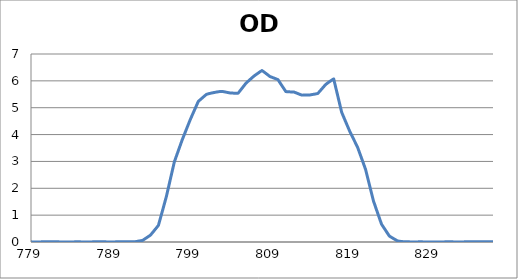
| Category | Series 0 |
|---|---|
| 2600.0 | 0.08 |
| 2599.0 | 0.078 |
| 2598.0 | 0.077 |
| 2597.0 | 0.075 |
| 2596.0 | 0.072 |
| 2595.0 | 0.069 |
| 2594.0 | 0.066 |
| 2593.0 | 0.063 |
| 2592.0 | 0.06 |
| 2591.0 | 0.057 |
| 2590.0 | 0.054 |
| 2589.0 | 0.051 |
| 2588.0 | 0.049 |
| 2587.0 | 0.046 |
| 2586.0 | 0.044 |
| 2585.0 | 0.043 |
| 2584.0 | 0.041 |
| 2583.0 | 0.04 |
| 2582.0 | 0.039 |
| 2581.0 | 0.039 |
| 2580.0 | 0.039 |
| 2579.0 | 0.039 |
| 2578.0 | 0.04 |
| 2577.0 | 0.041 |
| 2576.0 | 0.042 |
| 2575.0 | 0.044 |
| 2574.0 | 0.046 |
| 2573.0 | 0.049 |
| 2572.0 | 0.052 |
| 2571.0 | 0.055 |
| 2570.0 | 0.059 |
| 2569.0 | 0.063 |
| 2568.0 | 0.067 |
| 2567.0 | 0.072 |
| 2566.0 | 0.076 |
| 2565.0 | 0.08 |
| 2564.0 | 0.084 |
| 2563.0 | 0.087 |
| 2562.0 | 0.091 |
| 2561.0 | 0.093 |
| 2560.0 | 0.096 |
| 2559.0 | 0.098 |
| 2558.0 | 0.099 |
| 2557.0 | 0.101 |
| 2556.0 | 0.101 |
| 2555.0 | 0.102 |
| 2554.0 | 0.102 |
| 2553.0 | 0.102 |
| 2552.0 | 0.101 |
| 2551.0 | 0.1 |
| 2550.0 | 0.098 |
| 2549.0 | 0.095 |
| 2548.0 | 0.093 |
| 2547.0 | 0.09 |
| 2546.0 | 0.086 |
| 2545.0 | 0.083 |
| 2544.0 | 0.08 |
| 2543.0 | 0.076 |
| 2542.0 | 0.073 |
| 2541.0 | 0.069 |
| 2540.0 | 0.066 |
| 2539.0 | 0.063 |
| 2538.0 | 0.059 |
| 2537.0 | 0.056 |
| 2536.0 | 0.052 |
| 2535.0 | 0.049 |
| 2534.0 | 0.046 |
| 2533.0 | 0.044 |
| 2532.0 | 0.042 |
| 2531.0 | 0.039 |
| 2530.0 | 0.038 |
| 2529.0 | 0.037 |
| 2528.0 | 0.036 |
| 2527.0 | 0.035 |
| 2526.0 | 0.035 |
| 2525.0 | 0.035 |
| 2524.0 | 0.035 |
| 2523.0 | 0.035 |
| 2522.0 | 0.036 |
| 2521.0 | 0.037 |
| 2520.0 | 0.038 |
| 2519.0 | 0.039 |
| 2518.0 | 0.04 |
| 2517.0 | 0.041 |
| 2516.0 | 0.042 |
| 2515.0 | 0.043 |
| 2514.0 | 0.044 |
| 2513.0 | 0.045 |
| 2512.0 | 0.046 |
| 2511.0 | 0.046 |
| 2510.0 | 0.046 |
| 2509.0 | 0.047 |
| 2508.0 | 0.047 |
| 2507.0 | 0.047 |
| 2506.0 | 0.047 |
| 2505.0 | 0.046 |
| 2504.0 | 0.046 |
| 2503.0 | 0.045 |
| 2502.0 | 0.045 |
| 2501.0 | 0.044 |
| 2500.0 | 0.044 |
| 2499.0 | 0.043 |
| 2498.0 | 0.042 |
| 2497.0 | 0.041 |
| 2496.0 | 0.041 |
| 2495.0 | 0.04 |
| 2494.0 | 0.04 |
| 2493.0 | 0.039 |
| 2492.0 | 0.039 |
| 2491.0 | 0.039 |
| 2490.0 | 0.038 |
| 2489.0 | 0.038 |
| 2488.0 | 0.038 |
| 2487.0 | 0.038 |
| 2486.0 | 0.038 |
| 2485.0 | 0.038 |
| 2484.0 | 0.038 |
| 2483.0 | 0.037 |
| 2482.0 | 0.037 |
| 2481.0 | 0.037 |
| 2480.0 | 0.037 |
| 2479.0 | 0.037 |
| 2478.0 | 0.037 |
| 2477.0 | 0.037 |
| 2476.0 | 0.037 |
| 2475.0 | 0.037 |
| 2474.0 | 0.036 |
| 2473.0 | 0.036 |
| 2472.0 | 0.036 |
| 2471.0 | 0.036 |
| 2470.0 | 0.036 |
| 2469.0 | 0.036 |
| 2468.0 | 0.036 |
| 2467.0 | 0.037 |
| 2466.0 | 0.037 |
| 2465.0 | 0.038 |
| 2464.0 | 0.039 |
| 2463.0 | 0.04 |
| 2462.0 | 0.042 |
| 2461.0 | 0.044 |
| 2460.0 | 0.046 |
| 2459.0 | 0.048 |
| 2458.0 | 0.051 |
| 2457.0 | 0.053 |
| 2456.0 | 0.056 |
| 2455.0 | 0.06 |
| 2454.0 | 0.063 |
| 2453.0 | 0.067 |
| 2452.0 | 0.07 |
| 2451.0 | 0.074 |
| 2450.0 | 0.077 |
| 2449.0 | 0.081 |
| 2448.0 | 0.084 |
| 2447.0 | 0.087 |
| 2446.0 | 0.09 |
| 2445.0 | 0.093 |
| 2444.0 | 0.096 |
| 2443.0 | 0.098 |
| 2442.0 | 0.1 |
| 2441.0 | 0.101 |
| 2440.0 | 0.102 |
| 2439.0 | 0.103 |
| 2438.0 | 0.103 |
| 2437.0 | 0.103 |
| 2436.0 | 0.102 |
| 2435.0 | 0.101 |
| 2434.0 | 0.1 |
| 2433.0 | 0.098 |
| 2432.0 | 0.096 |
| 2431.0 | 0.094 |
| 2430.0 | 0.091 |
| 2429.0 | 0.089 |
| 2428.0 | 0.086 |
| 2427.0 | 0.083 |
| 2426.0 | 0.081 |
| 2425.0 | 0.078 |
| 2424.0 | 0.076 |
| 2423.0 | 0.074 |
| 2422.0 | 0.073 |
| 2421.0 | 0.072 |
| 2420.0 | 0.071 |
| 2419.0 | 0.071 |
| 2418.0 | 0.071 |
| 2417.0 | 0.071 |
| 2416.0 | 0.072 |
| 2415.0 | 0.073 |
| 2414.0 | 0.075 |
| 2413.0 | 0.077 |
| 2412.0 | 0.08 |
| 2411.0 | 0.083 |
| 2410.0 | 0.086 |
| 2409.0 | 0.088 |
| 2408.0 | 0.092 |
| 2407.0 | 0.095 |
| 2406.0 | 0.098 |
| 2405.0 | 0.101 |
| 2404.0 | 0.103 |
| 2403.0 | 0.106 |
| 2402.0 | 0.108 |
| 2401.0 | 0.11 |
| 2400.0 | 0.111 |
| 2399.0 | 0.112 |
| 2398.0 | 0.113 |
| 2397.0 | 0.113 |
| 2396.0 | 0.113 |
| 2395.0 | 0.112 |
| 2394.0 | 0.111 |
| 2393.0 | 0.109 |
| 2392.0 | 0.108 |
| 2391.0 | 0.105 |
| 2390.0 | 0.103 |
| 2389.0 | 0.1 |
| 2388.0 | 0.097 |
| 2387.0 | 0.094 |
| 2386.0 | 0.091 |
| 2385.0 | 0.089 |
| 2384.0 | 0.086 |
| 2383.0 | 0.083 |
| 2382.0 | 0.081 |
| 2381.0 | 0.079 |
| 2380.0 | 0.077 |
| 2379.0 | 0.076 |
| 2378.0 | 0.075 |
| 2377.0 | 0.074 |
| 2376.0 | 0.073 |
| 2375.0 | 0.073 |
| 2374.0 | 0.073 |
| 2373.0 | 0.073 |
| 2372.0 | 0.073 |
| 2371.0 | 0.073 |
| 2370.0 | 0.074 |
| 2369.0 | 0.074 |
| 2368.0 | 0.075 |
| 2367.0 | 0.075 |
| 2366.0 | 0.075 |
| 2365.0 | 0.075 |
| 2364.0 | 0.075 |
| 2363.0 | 0.075 |
| 2362.0 | 0.074 |
| 2361.0 | 0.074 |
| 2360.0 | 0.073 |
| 2359.0 | 0.071 |
| 2358.0 | 0.07 |
| 2357.0 | 0.068 |
| 2356.0 | 0.067 |
| 2355.0 | 0.065 |
| 2354.0 | 0.063 |
| 2353.0 | 0.061 |
| 2352.0 | 0.06 |
| 2351.0 | 0.058 |
| 2350.0 | 0.057 |
| 2349.0 | 0.056 |
| 2348.0 | 0.055 |
| 2347.0 | 0.055 |
| 2346.0 | 0.054 |
| 2345.0 | 0.055 |
| 2344.0 | 0.055 |
| 2343.0 | 0.056 |
| 2342.0 | 0.058 |
| 2341.0 | 0.059 |
| 2340.0 | 0.061 |
| 2339.0 | 0.063 |
| 2338.0 | 0.065 |
| 2337.0 | 0.067 |
| 2336.0 | 0.069 |
| 2335.0 | 0.071 |
| 2334.0 | 0.073 |
| 2333.0 | 0.075 |
| 2332.0 | 0.076 |
| 2331.0 | 0.077 |
| 2330.0 | 0.078 |
| 2329.0 | 0.078 |
| 2328.0 | 0.078 |
| 2327.0 | 0.078 |
| 2326.0 | 0.077 |
| 2325.0 | 0.076 |
| 2324.0 | 0.074 |
| 2323.0 | 0.073 |
| 2322.0 | 0.071 |
| 2321.0 | 0.069 |
| 2320.0 | 0.067 |
| 2319.0 | 0.065 |
| 2318.0 | 0.064 |
| 2317.0 | 0.062 |
| 2316.0 | 0.062 |
| 2315.0 | 0.061 |
| 2314.0 | 0.062 |
| 2313.0 | 0.063 |
| 2312.0 | 0.065 |
| 2311.0 | 0.068 |
| 2310.0 | 0.071 |
| 2309.0 | 0.075 |
| 2308.0 | 0.08 |
| 2307.0 | 0.086 |
| 2306.0 | 0.092 |
| 2305.0 | 0.098 |
| 2304.0 | 0.105 |
| 2303.0 | 0.113 |
| 2302.0 | 0.12 |
| 2301.0 | 0.127 |
| 2300.0 | 0.133 |
| 2299.0 | 0.14 |
| 2298.0 | 0.146 |
| 2297.0 | 0.151 |
| 2296.0 | 0.156 |
| 2295.0 | 0.16 |
| 2294.0 | 0.162 |
| 2293.0 | 0.165 |
| 2292.0 | 0.166 |
| 2291.0 | 0.166 |
| 2290.0 | 0.166 |
| 2289.0 | 0.164 |
| 2288.0 | 0.162 |
| 2287.0 | 0.159 |
| 2286.0 | 0.155 |
| 2285.0 | 0.15 |
| 2284.0 | 0.145 |
| 2283.0 | 0.139 |
| 2282.0 | 0.134 |
| 2281.0 | 0.128 |
| 2280.0 | 0.122 |
| 2279.0 | 0.116 |
| 2278.0 | 0.111 |
| 2277.0 | 0.106 |
| 2276.0 | 0.102 |
| 2275.0 | 0.099 |
| 2274.0 | 0.097 |
| 2273.0 | 0.096 |
| 2272.0 | 0.096 |
| 2271.0 | 0.097 |
| 2270.0 | 0.099 |
| 2269.0 | 0.102 |
| 2268.0 | 0.106 |
| 2267.0 | 0.111 |
| 2266.0 | 0.116 |
| 2265.0 | 0.121 |
| 2264.0 | 0.126 |
| 2263.0 | 0.132 |
| 2262.0 | 0.137 |
| 2261.0 | 0.142 |
| 2260.0 | 0.147 |
| 2259.0 | 0.151 |
| 2258.0 | 0.155 |
| 2257.0 | 0.157 |
| 2256.0 | 0.159 |
| 2255.0 | 0.16 |
| 2254.0 | 0.161 |
| 2253.0 | 0.16 |
| 2252.0 | 0.159 |
| 2251.0 | 0.157 |
| 2250.0 | 0.154 |
| 2249.0 | 0.151 |
| 2248.0 | 0.147 |
| 2247.0 | 0.142 |
| 2246.0 | 0.138 |
| 2245.0 | 0.134 |
| 2244.0 | 0.129 |
| 2243.0 | 0.125 |
| 2242.0 | 0.12 |
| 2241.0 | 0.116 |
| 2240.0 | 0.113 |
| 2239.0 | 0.11 |
| 2238.0 | 0.108 |
| 2237.0 | 0.106 |
| 2236.0 | 0.106 |
| 2235.0 | 0.105 |
| 2234.0 | 0.106 |
| 2233.0 | 0.107 |
| 2232.0 | 0.108 |
| 2231.0 | 0.11 |
| 2230.0 | 0.112 |
| 2229.0 | 0.114 |
| 2228.0 | 0.116 |
| 2227.0 | 0.117 |
| 2226.0 | 0.119 |
| 2225.0 | 0.12 |
| 2224.0 | 0.12 |
| 2223.0 | 0.121 |
| 2222.0 | 0.12 |
| 2221.0 | 0.119 |
| 2220.0 | 0.118 |
| 2219.0 | 0.115 |
| 2218.0 | 0.113 |
| 2217.0 | 0.111 |
| 2216.0 | 0.107 |
| 2215.0 | 0.105 |
| 2214.0 | 0.102 |
| 2213.0 | 0.098 |
| 2212.0 | 0.096 |
| 2211.0 | 0.093 |
| 2210.0 | 0.09 |
| 2209.0 | 0.089 |
| 2208.0 | 0.087 |
| 2207.0 | 0.087 |
| 2206.0 | 0.087 |
| 2205.0 | 0.087 |
| 2204.0 | 0.088 |
| 2203.0 | 0.09 |
| 2202.0 | 0.092 |
| 2201.0 | 0.094 |
| 2200.0 | 0.097 |
| 2199.0 | 0.1 |
| 2198.0 | 0.103 |
| 2197.0 | 0.105 |
| 2196.0 | 0.108 |
| 2195.0 | 0.11 |
| 2194.0 | 0.111 |
| 2193.0 | 0.112 |
| 2192.0 | 0.113 |
| 2191.0 | 0.113 |
| 2190.0 | 0.112 |
| 2189.0 | 0.111 |
| 2188.0 | 0.109 |
| 2187.0 | 0.107 |
| 2186.0 | 0.104 |
| 2185.0 | 0.102 |
| 2184.0 | 0.099 |
| 2183.0 | 0.097 |
| 2182.0 | 0.095 |
| 2181.0 | 0.095 |
| 2180.0 | 0.094 |
| 2179.0 | 0.095 |
| 2178.0 | 0.097 |
| 2177.0 | 0.099 |
| 2176.0 | 0.103 |
| 2175.0 | 0.108 |
| 2174.0 | 0.113 |
| 2173.0 | 0.12 |
| 2172.0 | 0.127 |
| 2171.0 | 0.135 |
| 2170.0 | 0.144 |
| 2169.0 | 0.152 |
| 2168.0 | 0.161 |
| 2167.0 | 0.169 |
| 2166.0 | 0.177 |
| 2165.0 | 0.185 |
| 2164.0 | 0.192 |
| 2163.0 | 0.198 |
| 2162.0 | 0.203 |
| 2161.0 | 0.207 |
| 2160.0 | 0.21 |
| 2159.0 | 0.212 |
| 2158.0 | 0.213 |
| 2157.0 | 0.212 |
| 2156.0 | 0.211 |
| 2155.0 | 0.209 |
| 2154.0 | 0.206 |
| 2153.0 | 0.202 |
| 2152.0 | 0.198 |
| 2151.0 | 0.193 |
| 2150.0 | 0.189 |
| 2149.0 | 0.185 |
| 2148.0 | 0.181 |
| 2147.0 | 0.178 |
| 2146.0 | 0.176 |
| 2145.0 | 0.175 |
| 2144.0 | 0.175 |
| 2143.0 | 0.177 |
| 2142.0 | 0.179 |
| 2141.0 | 0.183 |
| 2140.0 | 0.187 |
| 2139.0 | 0.193 |
| 2138.0 | 0.199 |
| 2137.0 | 0.206 |
| 2136.0 | 0.213 |
| 2135.0 | 0.22 |
| 2134.0 | 0.228 |
| 2133.0 | 0.234 |
| 2132.0 | 0.241 |
| 2131.0 | 0.247 |
| 2130.0 | 0.252 |
| 2129.0 | 0.257 |
| 2128.0 | 0.261 |
| 2127.0 | 0.264 |
| 2126.0 | 0.266 |
| 2125.0 | 0.268 |
| 2124.0 | 0.268 |
| 2123.0 | 0.269 |
| 2122.0 | 0.268 |
| 2121.0 | 0.267 |
| 2120.0 | 0.266 |
| 2119.0 | 0.265 |
| 2118.0 | 0.263 |
| 2117.0 | 0.262 |
| 2116.0 | 0.261 |
| 2115.0 | 0.26 |
| 2114.0 | 0.259 |
| 2113.0 | 0.259 |
| 2112.0 | 0.259 |
| 2111.0 | 0.26 |
| 2110.0 | 0.262 |
| 2109.0 | 0.263 |
| 2108.0 | 0.265 |
| 2107.0 | 0.267 |
| 2106.0 | 0.268 |
| 2105.0 | 0.27 |
| 2104.0 | 0.271 |
| 2103.0 | 0.272 |
| 2102.0 | 0.272 |
| 2101.0 | 0.271 |
| 2100.0 | 0.27 |
| 2099.0 | 0.267 |
| 2098.0 | 0.264 |
| 2097.0 | 0.261 |
| 2096.0 | 0.256 |
| 2095.0 | 0.252 |
| 2094.0 | 0.246 |
| 2093.0 | 0.241 |
| 2092.0 | 0.235 |
| 2091.0 | 0.228 |
| 2090.0 | 0.223 |
| 2089.0 | 0.217 |
| 2088.0 | 0.212 |
| 2087.0 | 0.208 |
| 2086.0 | 0.205 |
| 2085.0 | 0.202 |
| 2084.0 | 0.201 |
| 2083.0 | 0.201 |
| 2082.0 | 0.202 |
| 2081.0 | 0.203 |
| 2080.0 | 0.206 |
| 2079.0 | 0.209 |
| 2078.0 | 0.213 |
| 2077.0 | 0.217 |
| 2076.0 | 0.221 |
| 2075.0 | 0.224 |
| 2074.0 | 0.227 |
| 2073.0 | 0.23 |
| 2072.0 | 0.232 |
| 2071.0 | 0.232 |
| 2070.0 | 0.232 |
| 2069.0 | 0.23 |
| 2068.0 | 0.227 |
| 2067.0 | 0.223 |
| 2066.0 | 0.218 |
| 2065.0 | 0.212 |
| 2064.0 | 0.205 |
| 2063.0 | 0.198 |
| 2062.0 | 0.191 |
| 2061.0 | 0.184 |
| 2060.0 | 0.176 |
| 2059.0 | 0.17 |
| 2058.0 | 0.164 |
| 2057.0 | 0.159 |
| 2056.0 | 0.155 |
| 2055.0 | 0.153 |
| 2054.0 | 0.152 |
| 2053.0 | 0.152 |
| 2052.0 | 0.153 |
| 2051.0 | 0.156 |
| 2050.0 | 0.159 |
| 2049.0 | 0.163 |
| 2048.0 | 0.167 |
| 2047.0 | 0.171 |
| 2046.0 | 0.176 |
| 2045.0 | 0.18 |
| 2044.0 | 0.183 |
| 2043.0 | 0.186 |
| 2042.0 | 0.188 |
| 2041.0 | 0.189 |
| 2040.0 | 0.188 |
| 2039.0 | 0.187 |
| 2038.0 | 0.185 |
| 2037.0 | 0.181 |
| 2036.0 | 0.177 |
| 2035.0 | 0.172 |
| 2034.0 | 0.167 |
| 2033.0 | 0.162 |
| 2032.0 | 0.157 |
| 2031.0 | 0.152 |
| 2030.0 | 0.148 |
| 2029.0 | 0.145 |
| 2028.0 | 0.143 |
| 2027.0 | 0.143 |
| 2026.0 | 0.143 |
| 2025.0 | 0.145 |
| 2024.0 | 0.148 |
| 2023.0 | 0.152 |
| 2022.0 | 0.157 |
| 2021.0 | 0.162 |
| 2020.0 | 0.167 |
| 2019.0 | 0.172 |
| 2018.0 | 0.178 |
| 2017.0 | 0.183 |
| 2016.0 | 0.186 |
| 2015.0 | 0.19 |
| 2014.0 | 0.192 |
| 2013.0 | 0.194 |
| 2012.0 | 0.194 |
| 2011.0 | 0.194 |
| 2010.0 | 0.193 |
| 2009.0 | 0.192 |
| 2008.0 | 0.19 |
| 2007.0 | 0.187 |
| 2006.0 | 0.185 |
| 2005.0 | 0.182 |
| 2004.0 | 0.18 |
| 2003.0 | 0.178 |
| 2002.0 | 0.177 |
| 2001.0 | 0.176 |
| 2000.0 | 0.177 |
| 1999.0 | 0.179 |
| 1998.0 | 0.181 |
| 1997.0 | 0.185 |
| 1996.0 | 0.189 |
| 1995.0 | 0.193 |
| 1994.0 | 0.198 |
| 1993.0 | 0.204 |
| 1992.0 | 0.209 |
| 1991.0 | 0.213 |
| 1990.0 | 0.217 |
| 1989.0 | 0.22 |
| 1988.0 | 0.222 |
| 1987.0 | 0.224 |
| 1986.0 | 0.224 |
| 1985.0 | 0.223 |
| 1984.0 | 0.221 |
| 1983.0 | 0.218 |
| 1982.0 | 0.215 |
| 1981.0 | 0.211 |
| 1980.0 | 0.206 |
| 1979.0 | 0.201 |
| 1978.0 | 0.196 |
| 1977.0 | 0.191 |
| 1976.0 | 0.187 |
| 1975.0 | 0.183 |
| 1974.0 | 0.18 |
| 1973.0 | 0.177 |
| 1972.0 | 0.175 |
| 1971.0 | 0.174 |
| 1970.0 | 0.174 |
| 1969.0 | 0.174 |
| 1968.0 | 0.174 |
| 1967.0 | 0.175 |
| 1966.0 | 0.176 |
| 1965.0 | 0.177 |
| 1964.0 | 0.178 |
| 1963.0 | 0.178 |
| 1962.0 | 0.178 |
| 1961.0 | 0.178 |
| 1960.0 | 0.177 |
| 1959.0 | 0.175 |
| 1958.0 | 0.173 |
| 1957.0 | 0.17 |
| 1956.0 | 0.167 |
| 1955.0 | 0.164 |
| 1954.0 | 0.161 |
| 1953.0 | 0.158 |
| 1952.0 | 0.155 |
| 1951.0 | 0.152 |
| 1950.0 | 0.15 |
| 1949.0 | 0.149 |
| 1948.0 | 0.148 |
| 1947.0 | 0.148 |
| 1946.0 | 0.148 |
| 1945.0 | 0.149 |
| 1944.0 | 0.151 |
| 1943.0 | 0.152 |
| 1942.0 | 0.154 |
| 1941.0 | 0.155 |
| 1940.0 | 0.157 |
| 1939.0 | 0.158 |
| 1938.0 | 0.159 |
| 1937.0 | 0.16 |
| 1936.0 | 0.16 |
| 1935.0 | 0.159 |
| 1934.0 | 0.158 |
| 1933.0 | 0.158 |
| 1932.0 | 0.157 |
| 1931.0 | 0.155 |
| 1930.0 | 0.155 |
| 1929.0 | 0.154 |
| 1928.0 | 0.154 |
| 1927.0 | 0.154 |
| 1926.0 | 0.155 |
| 1925.0 | 0.157 |
| 1924.0 | 0.159 |
| 1923.0 | 0.161 |
| 1922.0 | 0.165 |
| 1921.0 | 0.169 |
| 1920.0 | 0.173 |
| 1919.0 | 0.178 |
| 1918.0 | 0.182 |
| 1917.0 | 0.184 |
| 1916.0 | 0.187 |
| 1915.0 | 0.189 |
| 1914.0 | 0.191 |
| 1913.0 | 0.193 |
| 1912.0 | 0.194 |
| 1911.0 | 0.194 |
| 1910.0 | 0.193 |
| 1909.0 | 0.191 |
| 1908.0 | 0.19 |
| 1907.0 | 0.188 |
| 1906.0 | 0.187 |
| 1905.0 | 0.186 |
| 1904.0 | 0.185 |
| 1903.0 | 0.185 |
| 1902.0 | 0.184 |
| 1901.0 | 0.185 |
| 1900.0 | 0.187 |
| 1899.0 | 0.19 |
| 1898.0 | 0.193 |
| 1897.0 | 0.196 |
| 1896.0 | 0.199 |
| 1895.0 | 0.202 |
| 1894.0 | 0.205 |
| 1893.0 | 0.208 |
| 1892.0 | 0.212 |
| 1891.0 | 0.215 |
| 1890.0 | 0.217 |
| 1889.0 | 0.218 |
| 1888.0 | 0.217 |
| 1887.0 | 0.216 |
| 1886.0 | 0.214 |
| 1885.0 | 0.211 |
| 1884.0 | 0.208 |
| 1883.0 | 0.204 |
| 1882.0 | 0.2 |
| 1881.0 | 0.195 |
| 1880.0 | 0.19 |
| 1879.0 | 0.185 |
| 1878.0 | 0.181 |
| 1877.0 | 0.177 |
| 1876.0 | 0.174 |
| 1875.0 | 0.171 |
| 1874.0 | 0.169 |
| 1873.0 | 0.168 |
| 1872.0 | 0.167 |
| 1871.0 | 0.166 |
| 1870.0 | 0.166 |
| 1869.0 | 0.166 |
| 1868.0 | 0.166 |
| 1867.0 | 0.167 |
| 1866.0 | 0.166 |
| 1865.0 | 0.166 |
| 1864.0 | 0.166 |
| 1863.0 | 0.166 |
| 1862.0 | 0.165 |
| 1861.0 | 0.166 |
| 1860.0 | 0.166 |
| 1859.0 | 0.167 |
| 1858.0 | 0.167 |
| 1857.0 | 0.167 |
| 1856.0 | 0.168 |
| 1855.0 | 0.168 |
| 1854.0 | 0.169 |
| 1853.0 | 0.171 |
| 1852.0 | 0.172 |
| 1851.0 | 0.173 |
| 1850.0 | 0.173 |
| 1849.0 | 0.174 |
| 1848.0 | 0.174 |
| 1847.0 | 0.176 |
| 1846.0 | 0.176 |
| 1845.0 | 0.176 |
| 1844.0 | 0.175 |
| 1843.0 | 0.173 |
| 1842.0 | 0.172 |
| 1841.0 | 0.172 |
| 1840.0 | 0.173 |
| 1839.0 | 0.173 |
| 1838.0 | 0.173 |
| 1837.0 | 0.175 |
| 1836.0 | 0.177 |
| 1835.0 | 0.179 |
| 1834.0 | 0.182 |
| 1833.0 | 0.185 |
| 1832.0 | 0.188 |
| 1831.0 | 0.193 |
| 1830.0 | 0.198 |
| 1829.0 | 0.202 |
| 1828.0 | 0.205 |
| 1827.0 | 0.209 |
| 1826.0 | 0.211 |
| 1825.0 | 0.213 |
| 1824.0 | 0.214 |
| 1823.0 | 0.213 |
| 1822.0 | 0.213 |
| 1821.0 | 0.213 |
| 1820.0 | 0.213 |
| 1819.0 | 0.212 |
| 1818.0 | 0.212 |
| 1817.0 | 0.211 |
| 1816.0 | 0.211 |
| 1815.0 | 0.212 |
| 1814.0 | 0.214 |
| 1813.0 | 0.216 |
| 1812.0 | 0.22 |
| 1811.0 | 0.225 |
| 1810.0 | 0.23 |
| 1809.0 | 0.234 |
| 1808.0 | 0.239 |
| 1807.0 | 0.244 |
| 1806.0 | 0.249 |
| 1805.0 | 0.253 |
| 1804.0 | 0.256 |
| 1803.0 | 0.259 |
| 1802.0 | 0.26 |
| 1801.0 | 0.26 |
| 1800.0 | 0.259 |
| 1799.0 | 0.257 |
| 1798.0 | 0.255 |
| 1797.0 | 0.252 |
| 1796.0 | 0.249 |
| 1795.0 | 0.246 |
| 1794.0 | 0.244 |
| 1793.0 | 0.242 |
| 1792.0 | 0.241 |
| 1791.0 | 0.241 |
| 1790.0 | 0.241 |
| 1789.0 | 0.242 |
| 1788.0 | 0.244 |
| 1787.0 | 0.245 |
| 1786.0 | 0.247 |
| 1785.0 | 0.248 |
| 1784.0 | 0.249 |
| 1783.0 | 0.249 |
| 1782.0 | 0.248 |
| 1781.0 | 0.246 |
| 1780.0 | 0.243 |
| 1779.0 | 0.239 |
| 1778.0 | 0.235 |
| 1777.0 | 0.23 |
| 1776.0 | 0.225 |
| 1775.0 | 0.22 |
| 1774.0 | 0.216 |
| 1773.0 | 0.212 |
| 1772.0 | 0.209 |
| 1771.0 | 0.208 |
| 1770.0 | 0.207 |
| 1769.0 | 0.207 |
| 1768.0 | 0.208 |
| 1767.0 | 0.209 |
| 1766.0 | 0.211 |
| 1765.0 | 0.212 |
| 1764.0 | 0.213 |
| 1763.0 | 0.213 |
| 1762.0 | 0.212 |
| 1761.0 | 0.21 |
| 1760.0 | 0.207 |
| 1759.0 | 0.203 |
| 1758.0 | 0.199 |
| 1757.0 | 0.195 |
| 1756.0 | 0.191 |
| 1755.0 | 0.188 |
| 1754.0 | 0.187 |
| 1753.0 | 0.187 |
| 1752.0 | 0.189 |
| 1751.0 | 0.193 |
| 1750.0 | 0.199 |
| 1749.0 | 0.207 |
| 1748.0 | 0.215 |
| 1747.0 | 0.224 |
| 1746.0 | 0.233 |
| 1745.0 | 0.241 |
| 1744.0 | 0.247 |
| 1743.0 | 0.252 |
| 1742.0 | 0.255 |
| 1741.0 | 0.255 |
| 1740.0 | 0.253 |
| 1739.0 | 0.249 |
| 1738.0 | 0.244 |
| 1737.0 | 0.237 |
| 1736.0 | 0.23 |
| 1735.0 | 0.224 |
| 1734.0 | 0.218 |
| 1733.0 | 0.215 |
| 1732.0 | 0.213 |
| 1731.0 | 0.215 |
| 1730.0 | 0.219 |
| 1729.0 | 0.226 |
| 1728.0 | 0.236 |
| 1727.0 | 0.248 |
| 1726.0 | 0.261 |
| 1725.0 | 0.274 |
| 1724.0 | 0.286 |
| 1723.0 | 0.297 |
| 1722.0 | 0.307 |
| 1721.0 | 0.315 |
| 1720.0 | 0.319 |
| 1719.0 | 0.321 |
| 1718.0 | 0.32 |
| 1717.0 | 0.317 |
| 1716.0 | 0.312 |
| 1715.0 | 0.305 |
| 1714.0 | 0.297 |
| 1713.0 | 0.29 |
| 1712.0 | 0.283 |
| 1711.0 | 0.278 |
| 1710.0 | 0.275 |
| 1709.0 | 0.274 |
| 1708.0 | 0.274 |
| 1707.0 | 0.277 |
| 1706.0 | 0.281 |
| 1705.0 | 0.285 |
| 1704.0 | 0.29 |
| 1703.0 | 0.293 |
| 1702.0 | 0.295 |
| 1701.0 | 0.296 |
| 1700.0 | 0.294 |
| 1699.0 | 0.291 |
| 1698.0 | 0.284 |
| 1697.0 | 0.277 |
| 1696.0 | 0.268 |
| 1695.0 | 0.258 |
| 1694.0 | 0.248 |
| 1693.0 | 0.237 |
| 1692.0 | 0.228 |
| 1691.0 | 0.219 |
| 1690.0 | 0.213 |
| 1689.0 | 0.208 |
| 1688.0 | 0.205 |
| 1687.0 | 0.204 |
| 1686.0 | 0.204 |
| 1685.0 | 0.205 |
| 1684.0 | 0.206 |
| 1683.0 | 0.207 |
| 1682.0 | 0.208 |
| 1681.0 | 0.208 |
| 1680.0 | 0.208 |
| 1679.0 | 0.206 |
| 1678.0 | 0.204 |
| 1677.0 | 0.202 |
| 1676.0 | 0.201 |
| 1675.0 | 0.2 |
| 1674.0 | 0.201 |
| 1673.0 | 0.204 |
| 1672.0 | 0.209 |
| 1671.0 | 0.216 |
| 1670.0 | 0.225 |
| 1669.0 | 0.235 |
| 1668.0 | 0.246 |
| 1667.0 | 0.257 |
| 1666.0 | 0.269 |
| 1665.0 | 0.28 |
| 1664.0 | 0.291 |
| 1663.0 | 0.301 |
| 1662.0 | 0.31 |
| 1661.0 | 0.318 |
| 1660.0 | 0.325 |
| 1659.0 | 0.333 |
| 1658.0 | 0.34 |
| 1657.0 | 0.347 |
| 1656.0 | 0.353 |
| 1655.0 | 0.359 |
| 1654.0 | 0.364 |
| 1653.0 | 0.369 |
| 1652.0 | 0.373 |
| 1651.0 | 0.375 |
| 1650.0 | 0.376 |
| 1649.0 | 0.376 |
| 1648.0 | 0.374 |
| 1647.0 | 0.37 |
| 1646.0 | 0.365 |
| 1645.0 | 0.36 |
| 1644.0 | 0.354 |
| 1643.0 | 0.35 |
| 1642.0 | 0.347 |
| 1641.0 | 0.347 |
| 1640.0 | 0.35 |
| 1639.0 | 0.356 |
| 1638.0 | 0.366 |
| 1637.0 | 0.378 |
| 1636.0 | 0.392 |
| 1635.0 | 0.407 |
| 1634.0 | 0.421 |
| 1633.0 | 0.434 |
| 1632.0 | 0.444 |
| 1631.0 | 0.45 |
| 1630.0 | 0.452 |
| 1629.0 | 0.449 |
| 1628.0 | 0.442 |
| 1627.0 | 0.43 |
| 1626.0 | 0.414 |
| 1625.0 | 0.395 |
| 1624.0 | 0.375 |
| 1623.0 | 0.355 |
| 1622.0 | 0.337 |
| 1621.0 | 0.323 |
| 1620.0 | 0.314 |
| 1619.0 | 0.31 |
| 1618.0 | 0.311 |
| 1617.0 | 0.317 |
| 1616.0 | 0.327 |
| 1615.0 | 0.338 |
| 1614.0 | 0.349 |
| 1613.0 | 0.359 |
| 1612.0 | 0.366 |
| 1611.0 | 0.369 |
| 1610.0 | 0.367 |
| 1609.0 | 0.36 |
| 1608.0 | 0.348 |
| 1607.0 | 0.332 |
| 1606.0 | 0.313 |
| 1605.0 | 0.292 |
| 1604.0 | 0.271 |
| 1603.0 | 0.251 |
| 1602.0 | 0.235 |
| 1601.0 | 0.224 |
| 1600.0 | 0.218 |
| 1599.0 | 0.218 |
| 1598.0 | 0.222 |
| 1597.0 | 0.228 |
| 1596.0 | 0.236 |
| 1595.0 | 0.242 |
| 1594.0 | 0.247 |
| 1593.0 | 0.247 |
| 1592.0 | 0.245 |
| 1591.0 | 0.238 |
| 1590.0 | 0.23 |
| 1589.0 | 0.22 |
| 1588.0 | 0.21 |
| 1587.0 | 0.203 |
| 1586.0 | 0.199 |
| 1585.0 | 0.2 |
| 1584.0 | 0.206 |
| 1583.0 | 0.216 |
| 1582.0 | 0.228 |
| 1581.0 | 0.242 |
| 1580.0 | 0.256 |
| 1579.0 | 0.267 |
| 1578.0 | 0.276 |
| 1577.0 | 0.281 |
| 1576.0 | 0.281 |
| 1575.0 | 0.277 |
| 1574.0 | 0.271 |
| 1573.0 | 0.262 |
| 1572.0 | 0.253 |
| 1571.0 | 0.246 |
| 1570.0 | 0.242 |
| 1569.0 | 0.242 |
| 1568.0 | 0.247 |
| 1567.0 | 0.258 |
| 1566.0 | 0.273 |
| 1565.0 | 0.291 |
| 1564.0 | 0.309 |
| 1563.0 | 0.327 |
| 1562.0 | 0.342 |
| 1561.0 | 0.352 |
| 1560.0 | 0.358 |
| 1559.0 | 0.358 |
| 1558.0 | 0.353 |
| 1557.0 | 0.343 |
| 1556.0 | 0.331 |
| 1555.0 | 0.318 |
| 1554.0 | 0.305 |
| 1553.0 | 0.296 |
| 1552.0 | 0.29 |
| 1551.0 | 0.29 |
| 1550.0 | 0.294 |
| 1549.0 | 0.301 |
| 1548.0 | 0.31 |
| 1547.0 | 0.319 |
| 1546.0 | 0.325 |
| 1545.0 | 0.328 |
| 1544.0 | 0.327 |
| 1543.0 | 0.32 |
| 1542.0 | 0.308 |
| 1541.0 | 0.293 |
| 1540.0 | 0.275 |
| 1539.0 | 0.256 |
| 1538.0 | 0.238 |
| 1537.0 | 0.225 |
| 1536.0 | 0.215 |
| 1535.0 | 0.212 |
| 1534.0 | 0.214 |
| 1533.0 | 0.222 |
| 1532.0 | 0.232 |
| 1531.0 | 0.243 |
| 1530.0 | 0.252 |
| 1529.0 | 0.26 |
| 1528.0 | 0.264 |
| 1527.0 | 0.264 |
| 1526.0 | 0.259 |
| 1525.0 | 0.253 |
| 1524.0 | 0.244 |
| 1523.0 | 0.237 |
| 1522.0 | 0.232 |
| 1521.0 | 0.231 |
| 1520.0 | 0.236 |
| 1519.0 | 0.245 |
| 1518.0 | 0.259 |
| 1517.0 | 0.274 |
| 1516.0 | 0.29 |
| 1515.0 | 0.304 |
| 1514.0 | 0.314 |
| 1513.0 | 0.321 |
| 1512.0 | 0.322 |
| 1511.0 | 0.319 |
| 1510.0 | 0.313 |
| 1509.0 | 0.306 |
| 1508.0 | 0.3 |
| 1507.0 | 0.297 |
| 1506.0 | 0.299 |
| 1505.0 | 0.305 |
| 1504.0 | 0.316 |
| 1503.0 | 0.33 |
| 1502.0 | 0.347 |
| 1501.0 | 0.363 |
| 1500.0 | 0.377 |
| 1499.0 | 0.387 |
| 1498.0 | 0.393 |
| 1497.0 | 0.394 |
| 1496.0 | 0.39 |
| 1495.0 | 0.383 |
| 1494.0 | 0.373 |
| 1493.0 | 0.362 |
| 1492.0 | 0.352 |
| 1491.0 | 0.344 |
| 1490.0 | 0.34 |
| 1489.0 | 0.339 |
| 1488.0 | 0.342 |
| 1487.0 | 0.348 |
| 1486.0 | 0.355 |
| 1485.0 | 0.361 |
| 1484.0 | 0.365 |
| 1483.0 | 0.365 |
| 1482.0 | 0.361 |
| 1481.0 | 0.353 |
| 1480.0 | 0.34 |
| 1479.0 | 0.325 |
| 1478.0 | 0.31 |
| 1477.0 | 0.295 |
| 1476.0 | 0.282 |
| 1475.0 | 0.273 |
| 1474.0 | 0.267 |
| 1473.0 | 0.265 |
| 1472.0 | 0.264 |
| 1471.0 | 0.263 |
| 1470.0 | 0.261 |
| 1469.0 | 0.256 |
| 1468.0 | 0.249 |
| 1467.0 | 0.238 |
| 1466.0 | 0.227 |
| 1465.0 | 0.216 |
| 1464.0 | 0.207 |
| 1463.0 | 0.203 |
| 1462.0 | 0.202 |
| 1461.0 | 0.205 |
| 1460.0 | 0.212 |
| 1459.0 | 0.22 |
| 1458.0 | 0.228 |
| 1457.0 | 0.233 |
| 1456.0 | 0.234 |
| 1455.0 | 0.23 |
| 1454.0 | 0.223 |
| 1453.0 | 0.213 |
| 1452.0 | 0.203 |
| 1451.0 | 0.195 |
| 1450.0 | 0.193 |
| 1449.0 | 0.197 |
| 1448.0 | 0.21 |
| 1447.0 | 0.23 |
| 1446.0 | 0.254 |
| 1445.0 | 0.279 |
| 1444.0 | 0.304 |
| 1443.0 | 0.322 |
| 1442.0 | 0.333 |
| 1441.0 | 0.337 |
| 1440.0 | 0.335 |
| 1439.0 | 0.326 |
| 1438.0 | 0.317 |
| 1437.0 | 0.31 |
| 1436.0 | 0.31 |
| 1435.0 | 0.318 |
| 1434.0 | 0.337 |
| 1433.0 | 0.364 |
| 1432.0 | 0.396 |
| 1431.0 | 0.428 |
| 1430.0 | 0.457 |
| 1429.0 | 0.477 |
| 1428.0 | 0.489 |
| 1427.0 | 0.489 |
| 1426.0 | 0.478 |
| 1425.0 | 0.457 |
| 1424.0 | 0.426 |
| 1423.0 | 0.391 |
| 1422.0 | 0.358 |
| 1421.0 | 0.33 |
| 1420.0 | 0.311 |
| 1419.0 | 0.306 |
| 1418.0 | 0.315 |
| 1417.0 | 0.332 |
| 1416.0 | 0.353 |
| 1415.0 | 0.375 |
| 1414.0 | 0.394 |
| 1413.0 | 0.405 |
| 1412.0 | 0.406 |
| 1411.0 | 0.396 |
| 1410.0 | 0.375 |
| 1409.0 | 0.347 |
| 1408.0 | 0.315 |
| 1407.0 | 0.281 |
| 1406.0 | 0.252 |
| 1405.0 | 0.228 |
| 1404.0 | 0.211 |
| 1403.0 | 0.205 |
| 1402.0 | 0.207 |
| 1401.0 | 0.216 |
| 1400.0 | 0.227 |
| 1399.0 | 0.236 |
| 1398.0 | 0.241 |
| 1397.0 | 0.239 |
| 1396.0 | 0.233 |
| 1395.0 | 0.224 |
| 1394.0 | 0.214 |
| 1393.0 | 0.202 |
| 1392.0 | 0.187 |
| 1391.0 | 0.175 |
| 1390.0 | 0.165 |
| 1389.0 | 0.156 |
| 1388.0 | 0.15 |
| 1387.0 | 0.15 |
| 1386.0 | 0.154 |
| 1385.0 | 0.164 |
| 1384.0 | 0.18 |
| 1383.0 | 0.203 |
| 1382.0 | 0.23 |
| 1381.0 | 0.256 |
| 1380.0 | 0.277 |
| 1379.0 | 0.291 |
| 1378.0 | 0.298 |
| 1377.0 | 0.295 |
| 1376.0 | 0.285 |
| 1375.0 | 0.267 |
| 1374.0 | 0.245 |
| 1373.0 | 0.223 |
| 1372.0 | 0.207 |
| 1371.0 | 0.203 |
| 1370.0 | 0.215 |
| 1369.0 | 0.24 |
| 1368.0 | 0.277 |
| 1367.0 | 0.32 |
| 1366.0 | 0.356 |
| 1365.0 | 0.385 |
| 1364.0 | 0.403 |
| 1363.0 | 0.405 |
| 1362.0 | 0.389 |
| 1361.0 | 0.358 |
| 1360.0 | 0.319 |
| 1359.0 | 0.274 |
| 1358.0 | 0.234 |
| 1357.0 | 0.206 |
| 1356.0 | 0.199 |
| 1355.0 | 0.214 |
| 1354.0 | 0.245 |
| 1353.0 | 0.281 |
| 1352.0 | 0.313 |
| 1351.0 | 0.334 |
| 1350.0 | 0.339 |
| 1349.0 | 0.327 |
| 1348.0 | 0.3 |
| 1347.0 | 0.26 |
| 1346.0 | 0.215 |
| 1345.0 | 0.171 |
| 1344.0 | 0.139 |
| 1343.0 | 0.125 |
| 1342.0 | 0.127 |
| 1341.0 | 0.141 |
| 1340.0 | 0.16 |
| 1339.0 | 0.176 |
| 1338.0 | 0.183 |
| 1337.0 | 0.178 |
| 1336.0 | 0.163 |
| 1335.0 | 0.143 |
| 1334.0 | 0.123 |
| 1333.0 | 0.113 |
| 1332.0 | 0.119 |
| 1331.0 | 0.142 |
| 1330.0 | 0.18 |
| 1329.0 | 0.223 |
| 1328.0 | 0.265 |
| 1327.0 | 0.297 |
| 1326.0 | 0.315 |
| 1325.0 | 0.316 |
| 1324.0 | 0.3 |
| 1323.0 | 0.27 |
| 1322.0 | 0.233 |
| 1321.0 | 0.196 |
| 1320.0 | 0.173 |
| 1319.0 | 0.17 |
| 1318.0 | 0.188 |
| 1317.0 | 0.224 |
| 1316.0 | 0.267 |
| 1315.0 | 0.307 |
| 1314.0 | 0.337 |
| 1313.0 | 0.351 |
| 1312.0 | 0.348 |
| 1311.0 | 0.33 |
| 1310.0 | 0.299 |
| 1309.0 | 0.26 |
| 1308.0 | 0.219 |
| 1307.0 | 0.186 |
| 1306.0 | 0.162 |
| 1305.0 | 0.151 |
| 1304.0 | 0.151 |
| 1303.0 | 0.156 |
| 1302.0 | 0.162 |
| 1301.0 | 0.163 |
| 1300.0 | 0.159 |
| 1299.0 | 0.149 |
| 1298.0 | 0.134 |
| 1297.0 | 0.118 |
| 1296.0 | 0.104 |
| 1295.0 | 0.092 |
| 1294.0 | 0.085 |
| 1293.0 | 0.082 |
| 1292.0 | 0.082 |
| 1291.0 | 0.083 |
| 1290.0 | 0.084 |
| 1289.0 | 0.086 |
| 1288.0 | 0.091 |
| 1287.0 | 0.1 |
| 1286.0 | 0.114 |
| 1285.0 | 0.133 |
| 1284.0 | 0.155 |
| 1283.0 | 0.176 |
| 1282.0 | 0.192 |
| 1281.0 | 0.201 |
| 1280.0 | 0.198 |
| 1279.0 | 0.186 |
| 1278.0 | 0.165 |
| 1277.0 | 0.14 |
| 1276.0 | 0.118 |
| 1275.0 | 0.105 |
| 1274.0 | 0.104 |
| 1273.0 | 0.116 |
| 1272.0 | 0.138 |
| 1271.0 | 0.163 |
| 1270.0 | 0.185 |
| 1269.0 | 0.2 |
| 1268.0 | 0.202 |
| 1267.0 | 0.194 |
| 1266.0 | 0.175 |
| 1265.0 | 0.151 |
| 1264.0 | 0.126 |
| 1263.0 | 0.104 |
| 1262.0 | 0.089 |
| 1261.0 | 0.083 |
| 1260.0 | 0.085 |
| 1259.0 | 0.091 |
| 1258.0 | 0.098 |
| 1257.0 | 0.103 |
| 1256.0 | 0.104 |
| 1255.0 | 0.102 |
| 1254.0 | 0.096 |
| 1253.0 | 0.089 |
| 1252.0 | 0.083 |
| 1251.0 | 0.078 |
| 1250.0 | 0.075 |
| 1249.0 | 0.073 |
| 1248.0 | 0.071 |
| 1247.0 | 0.07 |
| 1246.0 | 0.067 |
| 1245.0 | 0.064 |
| 1244.0 | 0.062 |
| 1243.0 | 0.061 |
| 1242.0 | 0.062 |
| 1241.0 | 0.067 |
| 1240.0 | 0.073 |
| 1239.0 | 0.079 |
| 1238.0 | 0.084 |
| 1237.0 | 0.086 |
| 1236.0 | 0.083 |
| 1235.0 | 0.077 |
| 1234.0 | 0.068 |
| 1233.0 | 0.06 |
| 1232.0 | 0.054 |
| 1231.0 | 0.052 |
| 1230.0 | 0.055 |
| 1229.0 | 0.061 |
| 1228.0 | 0.07 |
| 1227.0 | 0.078 |
| 1226.0 | 0.083 |
| 1225.0 | 0.083 |
| 1224.0 | 0.08 |
| 1223.0 | 0.073 |
| 1222.0 | 0.065 |
| 1221.0 | 0.058 |
| 1220.0 | 0.054 |
| 1219.0 | 0.054 |
| 1218.0 | 0.058 |
| 1217.0 | 0.064 |
| 1216.0 | 0.07 |
| 1215.0 | 0.074 |
| 1214.0 | 0.075 |
| 1213.0 | 0.072 |
| 1212.0 | 0.067 |
| 1211.0 | 0.061 |
| 1210.0 | 0.055 |
| 1209.0 | 0.053 |
| 1208.0 | 0.054 |
| 1207.0 | 0.058 |
| 1206.0 | 0.064 |
| 1205.0 | 0.068 |
| 1204.0 | 0.07 |
| 1203.0 | 0.069 |
| 1202.0 | 0.064 |
| 1201.0 | 0.058 |
| 1200.0 | 0.051 |
| 1199.0 | 0.048 |
| 1198.0 | 0.048 |
| 1197.0 | 0.051 |
| 1196.0 | 0.055 |
| 1195.0 | 0.058 |
| 1194.0 | 0.058 |
| 1193.0 | 0.055 |
| 1192.0 | 0.049 |
| 1191.0 | 0.043 |
| 1190.0 | 0.038 |
| 1189.0 | 0.037 |
| 1188.0 | 0.04 |
| 1187.0 | 0.044 |
| 1186.0 | 0.049 |
| 1185.0 | 0.05 |
| 1184.0 | 0.048 |
| 1183.0 | 0.043 |
| 1182.0 | 0.036 |
| 1181.0 | 0.031 |
| 1180.0 | 0.029 |
| 1179.0 | 0.031 |
| 1178.0 | 0.036 |
| 1177.0 | 0.042 |
| 1176.0 | 0.047 |
| 1175.0 | 0.048 |
| 1174.0 | 0.045 |
| 1173.0 | 0.039 |
| 1172.0 | 0.032 |
| 1171.0 | 0.028 |
| 1170.0 | 0.026 |
| 1169.0 | 0.029 |
| 1168.0 | 0.033 |
| 1167.0 | 0.038 |
| 1166.0 | 0.04 |
| 1165.0 | 0.039 |
| 1164.0 | 0.035 |
| 1163.0 | 0.029 |
| 1162.0 | 0.024 |
| 1161.0 | 0.022 |
| 1160.0 | 0.023 |
| 1159.0 | 0.025 |
| 1158.0 | 0.028 |
| 1157.0 | 0.028 |
| 1156.0 | 0.027 |
| 1155.0 | 0.025 |
| 1154.0 | 0.023 |
| 1153.0 | 0.024 |
| 1152.0 | 0.028 |
| 1151.0 | 0.033 |
| 1150.0 | 0.037 |
| 1149.0 | 0.038 |
| 1148.0 | 0.034 |
| 1147.0 | 0.028 |
| 1146.0 | 0.021 |
| 1145.0 | 0.017 |
| 1144.0 | 0.017 |
| 1143.0 | 0.022 |
| 1142.0 | 0.029 |
| 1141.0 | 0.035 |
| 1140.0 | 0.036 |
| 1139.0 | 0.033 |
| 1138.0 | 0.027 |
| 1137.0 | 0.019 |
| 1136.0 | 0.015 |
| 1135.0 | 0.015 |
| 1134.0 | 0.02 |
| 1133.0 | 0.027 |
| 1132.0 | 0.034 |
| 1131.0 | 0.035 |
| 1130.0 | 0.032 |
| 1129.0 | 0.025 |
| 1128.0 | 0.017 |
| 1127.0 | 0.013 |
| 1126.0 | 0.013 |
| 1125.0 | 0.018 |
| 1124.0 | 0.025 |
| 1123.0 | 0.029 |
| 1122.0 | 0.03 |
| 1121.0 | 0.025 |
| 1120.0 | 0.018 |
| 1119.0 | 0.012 |
| 1118.0 | 0.011 |
| 1117.0 | 0.017 |
| 1116.0 | 0.026 |
| 1115.0 | 0.036 |
| 1114.0 | 0.041 |
| 1113.0 | 0.04 |
| 1112.0 | 0.033 |
| 1111.0 | 0.023 |
| 1110.0 | 0.014 |
| 1109.0 | 0.009 |
| 1108.0 | 0.01 |
| 1107.0 | 0.015 |
| 1106.0 | 0.021 |
| 1105.0 | 0.025 |
| 1104.0 | 0.025 |
| 1103.0 | 0.022 |
| 1102.0 | 0.017 |
| 1101.0 | 0.012 |
| 1100.0 | 0.009 |
| 1099.0 | 0.008 |
| 1098.0 | 0.009 |
| 1097.0 | 0.009 |
| 1096.0 | 0.009 |
| 1095.0 | 0.008 |
| 1094.0 | 0.007 |
| 1093.0 | 0.005 |
| 1092.0 | 0.004 |
| 1091.0 | 0.004 |
| 1090.0 | 0.004 |
| 1089.0 | 0.005 |
| 1088.0 | 0.005 |
| 1087.0 | 0.005 |
| 1086.0 | 0.004 |
| 1085.0 | 0.004 |
| 1084.0 | 0.003 |
| 1083.0 | 0.003 |
| 1082.0 | 0.003 |
| 1081.0 | 0.003 |
| 1080.0 | 0.003 |
| 1079.0 | 0.002 |
| 1078.0 | 0.002 |
| 1077.0 | 0.002 |
| 1076.0 | 0.002 |
| 1075.0 | 0.002 |
| 1074.0 | 0.002 |
| 1073.0 | 0.002 |
| 1072.0 | 0.002 |
| 1071.0 | 0.002 |
| 1070.0 | 0.003 |
| 1069.0 | 0.003 |
| 1068.0 | 0.002 |
| 1067.0 | 0.002 |
| 1066.0 | 0.002 |
| 1065.0 | 0.001 |
| 1064.0 | 0.001 |
| 1063.0 | 0.001 |
| 1062.0 | 0.001 |
| 1061.0 | 0.001 |
| 1060.0 | 0.005 |
| 1059.0 | 0.005 |
| 1058.0 | 0.005 |
| 1057.0 | 0.009 |
| 1056.0 | 0.009 |
| 1055.0 | 0.006 |
| 1054.0 | 0.005 |
| 1053.0 | 0.008 |
| 1052.0 | 0.006 |
| 1051.0 | 0.007 |
| 1050.0 | 0.007 |
| 1049.0 | 0.005 |
| 1048.0 | 0.009 |
| 1047.0 | 0.009 |
| 1046.0 | 0.006 |
| 1045.0 | 0.006 |
| 1044.0 | 0.007 |
| 1043.0 | 0.003 |
| 1042.0 | 0.005 |
| 1041.0 | 0.005 |
| 1040.0 | 0.001 |
| 1039.0 | 0.002 |
| 1038.0 | 0.005 |
| 1037.0 | 0.004 |
| 1036.0 | 0.006 |
| 1035.0 | 0.005 |
| 1034.0 | 0.005 |
| 1033.0 | 0.005 |
| 1032.0 | 0.009 |
| 1031.0 | 0.009 |
| 1030.0 | 0.006 |
| 1029.0 | 0.005 |
| 1028.0 | 0.008 |
| 1027.0 | 0.006 |
| 1026.0 | 0.007 |
| 1025.0 | 0.007 |
| 1024.0 | 0.005 |
| 1023.0 | 0.007 |
| 1022.0 | 0.007 |
| 1021.0 | 0.006 |
| 1020.0 | 0.006 |
| 1019.0 | 0.008 |
| 1018.0 | 0.003 |
| 1017.0 | 0.005 |
| 1016.0 | 0.006 |
| 1015.0 | 0.001 |
| 1014.0 | 0.002 |
| 1013.0 | 0.006 |
| 1012.0 | 0.004 |
| 1011.0 | 0.007 |
| 1010.0 | 0.005 |
| 1009.0 | 0.005 |
| 1008.0 | 0.005 |
| 1007.0 | 0.009 |
| 1006.0 | 0.003 |
| 1005.0 | 0.006 |
| 1004.0 | 0.005 |
| 1003.0 | 0.008 |
| 1002.0 | 0.006 |
| 1001.0 | 0.007 |
| 1000.0 | 0.007 |
| 999.0 | 0.005 |
| 998.0 | 0.009 |
| 997.0 | 0.009 |
| 996.0 | 0.006 |
| 995.0 | 0.007 |
| 994.0 | 0.008 |
| 993.0 | 0.004 |
| 992.0 | 0.006 |
| 991.0 | 0.006 |
| 990.0 | 0.003 |
| 989.0 | 0.004 |
| 988.0 | 0.006 |
| 987.0 | 0.005 |
| 986.0 | 0.007 |
| 985.0 | 0.006 |
| 984.0 | 0.006 |
| 983.0 | 0.006 |
| 982.0 | 0.01 |
| 981.0 | 0.009 |
| 980.0 | 0.006 |
| 979.0 | 0.005 |
| 978.0 | 0.008 |
| 977.0 | 0.006 |
| 976.0 | 0.007 |
| 975.0 | 0.007 |
| 974.0 | 0.005 |
| 973.0 | 0.007 |
| 972.0 | 0.007 |
| 971.0 | 0.006 |
| 970.0 | 0.006 |
| 969.0 | 0.008 |
| 968.0 | 0.003 |
| 967.0 | 0.005 |
| 966.0 | 0.006 |
| 965.0 | 0.002 |
| 964.0 | 0.004 |
| 963.0 | 0.007 |
| 962.0 | 0.005 |
| 961.0 | 0.008 |
| 960.0 | 0.006 |
| 959.0 | 0.004 |
| 958.0 | 0.004 |
| 957.0 | 0.009 |
| 956.0 | 0.01 |
| 955.0 | 0.006 |
| 954.0 | 0.005 |
| 953.0 | 0.008 |
| 952.0 | 0.007 |
| 951.0 | 0.007 |
| 950.0 | 0.007 |
| 949.0 | 0.006 |
| 948.0 | 0.01 |
| 947.0 | 0.009 |
| 946.0 | 0.006 |
| 945.0 | 0.006 |
| 944.0 | 0.008 |
| 943.0 | 0.003 |
| 942.0 | 0.004 |
| 941.0 | 0.005 |
| 940.0 | 0.001 |
| 939.0 | 0.001 |
| 938.0 | 0.005 |
| 937.0 | 0.004 |
| 936.0 | 0.007 |
| 935.0 | 0.004 |
| 934.0 | 0.005 |
| 933.0 | 0.005 |
| 932.0 | 0.01 |
| 931.0 | 0.009 |
| 930.0 | 0.006 |
| 929.0 | 0.006 |
| 928.0 | 0.009 |
| 927.0 | 0.006 |
| 926.0 | 0.007 |
| 925.0 | 0.008 |
| 924.0 | 0.006 |
| 923.0 | 0.006 |
| 922.0 | 0.006 |
| 921.0 | 0.006 |
| 920.0 | 0.007 |
| 919.0 | 0.007 |
| 918.0 | 0.003 |
| 917.0 | 0.005 |
| 916.0 | 0.006 |
| 915.0 | 0.001 |
| 914.0 | 0.002 |
| 913.0 | 0.006 |
| 912.0 | 0.005 |
| 911.0 | 0.006 |
| 910.0 | 0.004 |
| 909.0 | 0.005 |
| 908.0 | 0.006 |
| 907.0 | 0.008 |
| 906.0 | 0.003 |
| 905.0 | 0.006 |
| 904.0 | 0.006 |
| 903.0 | 0.007 |
| 902.0 | 0.006 |
| 901.0 | 0.007 |
| 900.0 | 0.008 |
| 899.0 | 0.005 |
| 898.0 | 0.009 |
| 897.0 | 0.009 |
| 896.0 | 0.007 |
| 895.0 | 0.007 |
| 894.0 | 0.008 |
| 893.0 | 0.005 |
| 892.0 | 0.007 |
| 891.0 | 0.006 |
| 890.0 | 0.003 |
| 889.0 | 0.004 |
| 888.0 | 0.007 |
| 887.0 | 0.005 |
| 886.0 | 0.007 |
| 885.0 | 0.006 |
| 884.0 | 0.007 |
| 883.0 | 0.006 |
| 882.0 | 0.01 |
| 881.0 | 0.009 |
| 880.0 | 0.007 |
| 879.0 | 0.005 |
| 878.0 | 0.007 |
| 877.0 | 0.006 |
| 876.0 | 0.008 |
| 875.0 | 0.007 |
| 874.0 | 0.005 |
| 873.0 | 0.007 |
| 872.0 | 0.007 |
| 871.0 | 0.005 |
| 870.0 | 0.006 |
| 869.0 | 0.008 |
| 868.0 | 0.004 |
| 867.0 | 0.005 |
| 866.0 | 0.005 |
| 865.0 | 0.003 |
| 864.0 | 0.004 |
| 863.0 | 0.007 |
| 862.0 | 0.005 |
| 861.0 | 0.008 |
| 860.0 | 0.006 |
| 859.0 | 0.005 |
| 858.0 | 0.007 |
| 857.0 | 0.006 |
| 856.0 | 0.006 |
| 855.0 | 0.005 |
| 854.0 | 0.008 |
| 853.0 | 0.006 |
| 852.0 | 0.006 |
| 851.0 | 0.006 |
| 850.0 | 0.005 |
| 849.0 | 0.005 |
| 848.0 | 0.005 |
| 847.0 | 0.009 |
| 846.0 | 0.009 |
| 845.0 | 0.006 |
| 844.0 | 0.005 |
| 843.0 | 0.008 |
| 842.0 | 0.006 |
| 841.0 | 0.007 |
| 840.0 | 0.007 |
| 839.0 | 0.005 |
| 838.0 | 0.009 |
| 837.0 | 0.009 |
| 836.0 | 0.006 |
| 835.0 | 0.006 |
| 834.0 | 0.007 |
| 833.0 | 0.003 |
| 832.0 | 0.005 |
| 831.0 | 0.005 |
| 830.0 | 0.001 |
| 829.0 | 0.002 |
| 828.0 | 0.005 |
| 827.0 | 0.004 |
| 826.0 | 0.006 |
| 825.0 | 0.044 |
| 824.0 | 0.218 |
| 823.0 | 0.668 |
| 822.0 | 1.522 |
| 821.0 | 2.705 |
| 820.0 | 3.526 |
| 819.0 | 4.132 |
| 818.0 | 4.832 |
| 817.0 | 6.071 |
| 816.0 | 5.866 |
| 815.0 | 5.529 |
| 814.0 | 5.475 |
| 813.0 | 5.469 |
| 812.0 | 5.585 |
| 811.0 | 5.597 |
| 810.0 | 6.046 |
| 809.0 | 6.161 |
| 808.0 | 6.387 |
| 807.0 | 6.18 |
| 806.0 | 5.917 |
| 805.0 | 5.539 |
| 804.0 | 5.548 |
| 803.0 | 5.607 |
| 802.0 | 5.567 |
| 801.0 | 5.491 |
| 800.0 | 5.232 |
| 799.0 | 4.561 |
| 798.0 | 3.817 |
| 797.0 | 2.987 |
| 796.0 | 1.701 |
| 795.0 | 0.623 |
| 794.0 | 0.257 |
| 793.0 | 0.059 |
| 792.0 | 0.008 |
| 791.0 | 0.007 |
| 790.0 | 0.006 |
| 789.0 | 0.003 |
| 788.0 | 0.006 |
| 787.0 | 0.006 |
| 786.0 | 0.002 |
| 785.0 | 0.006 |
| 784.0 | 0.004 |
| 783.0 | 0.002 |
| 782.0 | 0.008 |
| 781.0 | 0.008 |
| 780.0 | 0.004 |
| 779.0 | 0.005 |
| 778.0 | 0.005 |
| 777.0 | 0.005 |
| 776.0 | 0.009 |
| 775.0 | 0.009 |
| 774.0 | 0.006 |
| 773.0 | 0.005 |
| 772.0 | 0.008 |
| 771.0 | 0.006 |
| 770.0 | 0.007 |
| 769.0 | 0.007 |
| 768.0 | 0.005 |
| 767.0 | 0.009 |
| 766.0 | 0.009 |
| 765.0 | 0.006 |
| 764.0 | 0.006 |
| 763.0 | 0.007 |
| 762.0 | 0.003 |
| 761.0 | 0.005 |
| 760.0 | 0.005 |
| 759.0 | 0.001 |
| 758.0 | 0.002 |
| 757.0 | 0.005 |
| 756.0 | 0.004 |
| 755.0 | 0.006 |
| 754.0 | 0.005 |
| 753.0 | 0.005 |
| 752.0 | 0.005 |
| 751.0 | 0.009 |
| 750.0 | 0.009 |
| 749.0 | 0.006 |
| 748.0 | 0.005 |
| 747.0 | 0.008 |
| 746.0 | 0.006 |
| 745.0 | 0.007 |
| 744.0 | 0.007 |
| 743.0 | 0.005 |
| 742.0 | 0.007 |
| 741.0 | 0.007 |
| 740.0 | 0.006 |
| 739.0 | 0.006 |
| 738.0 | 0.008 |
| 737.0 | 0.003 |
| 736.0 | 0.005 |
| 735.0 | 0.006 |
| 734.0 | 0.001 |
| 733.0 | 0.002 |
| 732.0 | 0.005 |
| 731.0 | 0.003 |
| 730.0 | 0.006 |
| 729.0 | 0.004 |
| 728.0 | 0.004 |
| 727.0 | 0.004 |
| 726.0 | 0.008 |
| 725.0 | 0.003 |
| 724.0 | 0.006 |
| 723.0 | 0.005 |
| 722.0 | 0.008 |
| 721.0 | 0.006 |
| 720.0 | 0.007 |
| 719.0 | 0.007 |
| 718.0 | 0.005 |
| 717.0 | 0.009 |
| 716.0 | 0.009 |
| 715.0 | 0.006 |
| 714.0 | 0.007 |
| 713.0 | 0.008 |
| 712.0 | 0.004 |
| 711.0 | 0.006 |
| 710.0 | 0.006 |
| 709.0 | 0.003 |
| 708.0 | 0.004 |
| 707.0 | 0.006 |
| 706.0 | 0.005 |
| 705.0 | 0.007 |
| 704.0 | 0.006 |
| 703.0 | 0.006 |
| 702.0 | 0.006 |
| 701.0 | 0.01 |
| 700.0 | 0.009 |
| 699.0 | 0.004 |
| 698.0 | 0.003 |
| 697.0 | 0.006 |
| 696.0 | 0.004 |
| 695.0 | 0.005 |
| 694.0 | 0.005 |
| 693.0 | 0.003 |
| 692.0 | 0.004 |
| 691.0 | 0.005 |
| 690.0 | 0.004 |
| 689.0 | 0.005 |
| 688.0 | 0.006 |
| 687.0 | 0.003 |
| 686.0 | 0.005 |
| 685.0 | 0.006 |
| 684.0 | 0.002 |
| 683.0 | 0.004 |
| 682.0 | 0.007 |
| 681.0 | 0.005 |
| 680.0 | 0.008 |
| 679.0 | 0.006 |
| 678.0 | 0.004 |
| 677.0 | 0.004 |
| 676.0 | 0.009 |
| 675.0 | 0.01 |
| 674.0 | 0.006 |
| 673.0 | 0.005 |
| 672.0 | 0.008 |
| 671.0 | 0.007 |
| 670.0 | 0.007 |
| 669.0 | 0.007 |
| 668.0 | 0.006 |
| 667.0 | 0.01 |
| 666.0 | 0.009 |
| 665.0 | 0.006 |
| 664.0 | 0.006 |
| 663.0 | 0.008 |
| 662.0 | 0.003 |
| 661.0 | 0.004 |
| 660.0 | 0.005 |
| 659.0 | 0.001 |
| 658.0 | 0.001 |
| 657.0 | 0.005 |
| 656.0 | 0.004 |
| 655.0 | 0.007 |
| 654.0 | 0.004 |
| 653.0 | 0.005 |
| 652.0 | 0.005 |
| 651.0 | 0.01 |
| 650.0 | 0.009 |
| 649.0 | 0.006 |
| 648.0 | 0.006 |
| 647.0 | 0.009 |
| 646.0 | 0.006 |
| 645.0 | 0.007 |
| 644.0 | 0.008 |
| 643.0 | 0.006 |
| 642.0 | 0.006 |
| 641.0 | 0.006 |
| 640.0 | 0.006 |
| 639.0 | 0.007 |
| 638.0 | 0.007 |
| 637.0 | 0.003 |
| 636.0 | 0.005 |
| 635.0 | 0.006 |
| 634.0 | 0.001 |
| 633.0 | 0.002 |
| 632.0 | 0.006 |
| 631.0 | 0.005 |
| 630.0 | 0.006 |
| 629.0 | 0.004 |
| 628.0 | 0.007 |
| 627.0 | 0.005 |
| 626.0 | 0.009 |
| 625.0 | 0.009 |
| 624.0 | 0.006 |
| 623.0 | 0.007 |
| 622.0 | 0.008 |
| 621.0 | 0.004 |
| 620.0 | 0.006 |
| 619.0 | 0.006 |
| 618.0 | 0.004 |
| 617.0 | 0.007 |
| 616.0 | 0.005 |
| 615.0 | 0.009 |
| 614.0 | 0.009 |
| 613.0 | 0.005 |
| 612.0 | 0.007 |
| 611.0 | 0.008 |
| 610.0 | 0.003 |
| 609.0 | 0.007 |
| 608.0 | 0.007 |
| 607.0 | 0.007 |
| 606.0 | 0.007 |
| 605.0 | 0.008 |
| 604.0 | 0.009 |
| 603.0 | 0.009 |
| 602.0 | 0.009 |
| 601.0 | 0.009 |
| 600.0 | 0.009 |
| 599.0 | 0.009 |
| 598.0 | 0.012 |
| 597.0 | 0.024 |
| 596.0 | 0.053 |
| 595.0 | 0.075 |
| 594.0 | 0.081 |
| 593.0 | 0.096 |
| 592.0 | 0.13 |
| 591.0 | 0.151 |
| 590.0 | 0.158 |
| 589.0 | 0.195 |
| 588.0 | 0.245 |
| 587.0 | 0.292 |
| 586.0 | 0.317 |
| 585.0 | 0.312 |
| 584.0 | 0.317 |
| 583.0 | 0.326 |
| 582.0 | 0.337 |
| 581.0 | 0.341 |
| 580.0 | 0.342 |
| 579.0 | 0.386 |
| 578.0 | 0.463 |
| 577.0 | 0.527 |
| 576.0 | 0.595 |
| 575.0 | 0.659 |
| 574.0 | 0.707 |
| 573.0 | 0.779 |
| 572.0 | 0.81 |
| 571.0 | 0.784 |
| 570.0 | 0.79 |
| 569.0 | 0.858 |
| 568.0 | 0.984 |
| 567.0 | 1.113 |
| 566.0 | 1.162 |
| 565.0 | 1.181 |
| 564.0 | 1.248 |
| 563.0 | 1.339 |
| 562.0 | 1.443 |
| 561.0 | 1.565 |
| 560.0 | 1.597 |
| 559.0 | 1.655 |
| 558.0 | 1.875 |
| 557.0 | 2.165 |
| 556.0 | 2.378 |
| 555.0 | 2.626 |
| 554.0 | 2.944 |
| 553.0 | 3.352 |
| 552.0 | 3.818 |
| 551.0 | 4.686 |
| 550.0 | 4.664 |
| 549.0 | 4.292 |
| 548.0 | 4.216 |
| 547.0 | 4.224 |
| 546.0 | 4.362 |
| 545.0 | 4.248 |
| 544.0 | 4.584 |
| 543.0 | 4.396 |
| 542.0 | 4.208 |
| 541.0 | 4.186 |
| 540.0 | 4.2 |
| 539.0 | 4.274 |
| 538.0 | 4.621 |
| 537.0 | 4.445 |
| 536.0 | 4.231 |
| 535.0 | 4.185 |
| 534.0 | 4.207 |
| 533.0 | 4.35 |
| 532.0 | 4.445 |
| 531.0 | 4.215 |
| 530.0 | 4.215 |
| 529.0 | 4.3 |
| 528.0 | 4.407 |
| 527.0 | 4.282 |
| 526.0 | 4.565 |
| 525.0 | 4.395 |
| 524.0 | 4.177 |
| 523.0 | 4.214 |
| 522.0 | 4.214 |
| 521.0 | 4.309 |
| 520.0 | 4.515 |
| 519.0 | 4.382 |
| 518.0 | 4.17 |
| 517.0 | 4.281 |
| 516.0 | 4.318 |
| 515.0 | 4.246 |
| 514.0 | 4.53 |
| 513.0 | 4.43 |
| 512.0 | 4.198 |
| 511.0 | 4.289 |
| 510.0 | 4.299 |
| 509.0 | 4.318 |
| 508.0 | 4.6 |
| 507.0 | 4.443 |
| 506.0 | 4.213 |
| 505.0 | 4.308 |
| 504.0 | 4.308 |
| 503.0 | 4.298 |
| 502.0 | 4.581 |
| 501.0 | 4.47 |
| 500.0 | 4.213 |
| 499.0 | 4.253 |
| 498.0 | 4.261 |
| 497.0 | 4.279 |
| 496.0 | 4.513 |
| 495.0 | 4.358 |
| 494.0 | 4.197 |
| 493.0 | 4.228 |
| 492.0 | 4.182 |
| 491.0 | 4.358 |
| 490.0 | 4.598 |
| 489.0 | 4.392 |
| 488.0 | 4.212 |
| 487.0 | 4.316 |
| 486.0 | 4.326 |
| 485.0 | 4.326 |
| 484.0 | 4.545 |
| 483.0 | 4.326 |
| 482.0 | 4.189 |
| 481.0 | 4.252 |
| 480.0 | 4.243 |
| 479.0 | 4.296 |
| 478.0 | 4.496 |
| 477.0 | 4.336 |
| 476.0 | 4.203 |
| 475.0 | 4.268 |
| 474.0 | 4.286 |
| 473.0 | 4.356 |
| 472.0 | 4.527 |
| 471.0 | 4.315 |
| 470.0 | 4.18 |
| 469.0 | 4.258 |
| 468.0 | 4.241 |
| 467.0 | 4.304 |
| 466.0 | 4.542 |
| 465.0 | 4.304 |
| 464.0 | 4.172 |
| 463.0 | 4.186 |
| 462.0 | 4.201 |
| 461.0 | 4.388 |
| 460.0 | 4.576 |
| 459.0 | 4.365 |
| 458.0 | 4.275 |
| 457.0 | 4.257 |
| 456.0 | 4.156 |
| 455.0 | 4.303 |
| 454.0 | 4.633 |
| 453.0 | 4.387 |
| 452.0 | 4.248 |
| 451.0 | 4.191 |
| 450.0 | 4.184 |
| 449.0 | 4.411 |
| 448.0 | 4.654 |
| 447.0 | 4.423 |
| 446.0 | 4.238 |
| 445.0 | 4.141 |
| 444.0 | 4.19 |
| 443.0 | 4.491 |
| 442.0 | 4.698 |
| 441.0 | 4.409 |
| 440.0 | 4.246 |
| 439.0 | 4.245 |
| 438.0 | 4.263 |
| 437.0 | 4.362 |
| 436.0 | 4.476 |
| 435.0 | 4.271 |
| 434.0 | 4.174 |
| 433.0 | 4.329 |
| 432.0 | 4.299 |
| 431.0 | 4.328 |
| 430.0 | 4.537 |
| 429.0 | 4.339 |
| 428.0 | 4.235 |
| 427.0 | 4.338 |
| 426.0 | 4.328 |
| 425.0 | 4.394 |
| 424.0 | 4.608 |
| 423.0 | 4.288 |
| 422.0 | 4.218 |
| 421.0 | 4.473 |
| 420.0 | 4.348 |
| 419.0 | 4.431 |
| 418.0 | 4.908 |
| 417.0 | 4.259 |
| 416.0 | 4.104 |
| 415.0 | 4.233 |
| 414.0 | 4.325 |
| 413.0 | 4.357 |
| 412.0 | 4.693 |
| 411.0 | 4.315 |
| 410.0 | 4.17 |
| 409.0 | 4.169 |
| 408.0 | 4.24 |
| 407.0 | 4.314 |
| 406.0 | 4.549 |
| 405.0 | 4.345 |
| 404.0 | 4.284 |
| 403.0 | 4.355 |
| 402.0 | 4.265 |
| 401.0 | 4.415 |
| 400.0 | 5.043 |
| 399.0 | 4.946 |
| 398.0 | 4.366 |
| 397.0 | 3.545 |
| 396.0 | 3.294 |
| 395.0 | 2.888 |
| 394.0 | 2.254 |
| 393.0 | 1.802 |
| 392.0 | 1.639 |
| 391.0 | 1.767 |
| 390.0 | 2.044 |
| 389.0 | 2.144 |
| 388.0 | 2.259 |
| 387.0 | 2.561 |
| 386.0 | 2.77 |
| 385.0 | 2.786 |
| 384.0 | 2.966 |
| 383.0 | 2.751 |
| 382.0 | 2.281 |
| 381.0 | 2.093 |
| 380.0 | 1.909 |
| 379.0 | 1.763 |
| 378.0 | 1.872 |
| 377.0 | 2.176 |
| 376.0 | 2.366 |
| 375.0 | 2.338 |
| 374.0 | 2.04 |
| 373.0 | 1.623 |
| 372.0 | 1.358 |
| 371.0 | 1.256 |
| 370.0 | 1.309 |
| 369.0 | 1.525 |
| 368.0 | 1.881 |
| 367.0 | 2.219 |
| 366.0 | 2.387 |
| 365.0 | 2.308 |
| 364.0 | 2.177 |
| 363.0 | 2.213 |
| 362.0 | 2.468 |
| 361.0 | 2.885 |
| 360.0 | 3.204 |
| 359.0 | 3.375 |
| 358.0 | 3.812 |
| 357.0 | 5.936 |
| 356.0 | 4.245 |
| 355.0 | 4.613 |
| 354.0 | 4.656 |
| 353.0 | 4.367 |
| 352.0 | 4.253 |
| 351.0 | 4.227 |
| 350.0 | 4.178 |
| 349.0 | 4.758 |
| 348.0 | 4.892 |
| 347.0 | 4.252 |
| 346.0 | 4.155 |
| 345.0 | 4.365 |
| 344.0 | 4.234 |
| 343.0 | 4.933 |
| 342.0 | 4.702 |
| 341.0 | 4.364 |
| 340.0 | 4.147 |
| 339.0 | 4.224 |
| 338.0 | 4.233 |
| 337.0 | 4.63 |
| 336.0 | 4.755 |
| 335.0 | 4.25 |
| 334.0 | 4.19 |
| 333.0 | 4.24 |
| 332.0 | 4.19 |
| 331.0 | 4.726 |
| 330.0 | 4.55 |
| 329.0 | 4.276 |
| 328.0 | 4.181 |
| 327.0 | 4.197 |
| 326.0 | 4.276 |
| 325.0 | 4.699 |
| 324.0 | 4.928 |
| 323.0 | 4.204 |
| 322.0 | 4.204 |
| 321.0 | 4.164 |
| 320.0 | 4.238 |
| 319.0 | 4.605 |
| 318.0 | 4.272 |
| 317.0 | 4.272 |
| 316.0 | 4.356 |
| 315.0 | 4.694 |
| 314.0 | 4.271 |
| 313.0 | 4.882 |
| 312.0 | 4.747 |
| 311.0 | 4.344 |
| 310.0 | 4.251 |
| 309.0 | 4.508 |
| 308.0 | 4.19 |
| 307.0 | 4.881 |
| 306.0 | 4.309 |
| 305.0 | 4.331 |
| 304.0 | 4.258 |
| 303.0 | 4.745 |
| 302.0 | 4.24 |
| 301.0 | 5.075 |
| 300.0 | 4.665 |
| 299.0 | 4.388 |
| 298.0 | 4.171 |
| 297.0 | 4.557 |
| 296.0 | 4.22 |
| 295.0 | 4.84 |
| 294.0 | 4.84 |
| 293.0 | 4.35 |
| 292.0 | 4.147 |
| 291.0 | 4.771 |
| 290.0 | 4.245 |
| 289.0 | 5.014 |
| 288.0 | 4.616 |
| 287.0 | 4.315 |
| 286.0 | 4.184 |
| 285.0 | 5.013 |
| 284.0 | 4.303 |
| 283.0 | 4.769 |
| 282.0 | 4.66 |
| 281.0 | 4.396 |
| 280.0 | 4.224 |
| 279.0 | 4.233 |
| 278.0 | 4.207 |
| 277.0 | 4.409 |
| 276.0 | 4.37 |
| 275.0 | 4.27 |
| 274.0 | 4.142 |
| 273.0 | 4.241 |
| 272.0 | 4.29 |
| 271.0 | 4.289 |
| 270.0 | 4.279 |
| 269.0 | 4.25 |
| 268.0 | 4.59 |
| 267.0 | 4.833 |
| 266.0 | 5.067 |
| 265.0 | 4.833 |
| 264.0 | 5.134 |
| 263.0 | 4.912 |
| 262.0 | 4.179 |
| 261.0 | 4.163 |
| 260.0 | 4.735 |
| 259.0 | 4.133 |
| 258.0 | 5.066 |
| 257.0 | 4.433 |
| 256.0 | 4.378 |
| 255.0 | 4.11 |
| 254.0 | 4.83 |
| 253.0 | 4.131 |
| 252.0 | 5.005 |
| 251.0 | 4.629 |
| 250.0 | 4.183 |
| 249.0 | 4.151 |
| 248.0 | 4.628 |
| 247.0 | 4.166 |
| 246.0 | 5.606 |
| 245.0 | 4.491 |
| 244.0 | 4.337 |
| 243.0 | 4.142 |
| 242.0 | 4.262 |
| 241.0 | 4.234 |
| 240.0 | 4.906 |
| 239.0 | 4.387 |
| 238.0 | 4.173 |
| 237.0 | 4.086 |
| 236.0 | 4.675 |
| 235.0 | 4.173 |
| 234.0 | 4.864 |
| 233.0 | 4.507 |
| 232.0 | 4.181 |
| 231.0 | 4.172 |
| 230.0 | 4.292 |
| 229.0 | 4.188 |
| 228.0 | 4.699 |
| 227.0 | 4.504 |
| 226.0 | 4.185 |
| 225.0 | 4.153 |
| 224.0 | 4.137 |
| 223.0 | 4.151 |
| 222.0 | 4.556 |
| 221.0 | 4.693 |
| 220.0 | 4.111 |
| 219.0 | 4.197 |
| 218.0 | 4.293 |
| 217.0 | 4.178 |
| 216.0 | 4.513 |
| 215.0 | 4.531 |
| 214.0 | 4.072 |
| 213.0 | 4.175 |
| 212.0 | 4.346 |
| 211.0 | 4.208 |
| 210.0 | 4.457 |
| 209.0 | 4.742 |
| 208.0 | 4.08 |
| 207.0 | 4.073 |
| 206.0 | 4.232 |
| 205.0 | 4.185 |
| 204.0 | 4.293 |
| 203.0 | 4.27 |
| 202.0 | 3.952 |
| 201.0 | 4.006 |
| 200.0 | 3.983 |